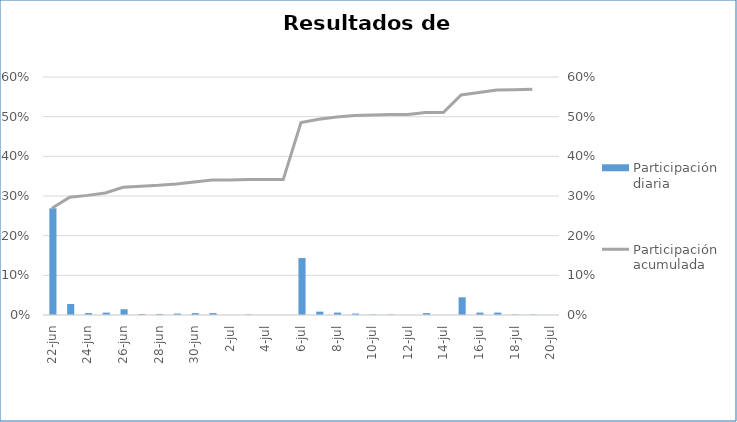
| Category | Participación diaria |
|---|---|
| 2020-06-22 | 0.269 |
| 2020-06-23 | 0.028 |
| 2020-06-24 | 0.005 |
| 2020-06-25 | 0.006 |
| 2020-06-26 | 0.014 |
| 2020-06-27 | 0.002 |
| 2020-06-28 | 0.002 |
| 2020-06-29 | 0.004 |
| 2020-06-30 | 0.005 |
| 2020-07-01 | 0.005 |
| 2020-07-02 | 0 |
| 2020-07-03 | 0.001 |
| 2020-07-04 | 0 |
| 2020-07-05 | 0 |
| 2020-07-06 | 0.144 |
| 2020-07-07 | 0.008 |
| 2020-07-08 | 0.006 |
| 2020-07-09 | 0.004 |
| 2020-07-10 | 0.001 |
| 2020-07-11 | 0.001 |
| 2020-07-12 | 0 |
| 2020-07-13 | 0.005 |
| 2020-07-14 | 0 |
| 2020-07-15 | 0.045 |
| 2020-07-16 | 0.006 |
| 2020-07-17 | 0.006 |
| 2020-07-18 | 0.001 |
| 2020-07-19 | 0.001 |
| 2020-07-20 | 0 |